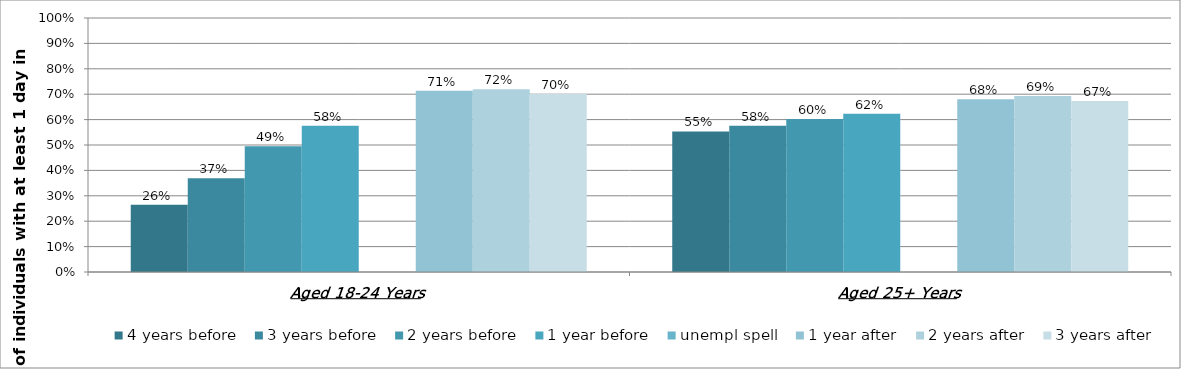
| Category | 4 years before | 3 years before | 2 years before | 1 year before | unempl spell | 1 year after | 2 years after | 3 years after |
|---|---|---|---|---|---|---|---|---|
| Aged 18-24 Years | 0.264 | 0.369 | 0.495 | 0.576 | 0 | 0.714 | 0.719 | 0.701 |
| Aged 25+ Years | 0.553 | 0.576 | 0.603 | 0.623 | 0 | 0.68 | 0.693 | 0.673 |